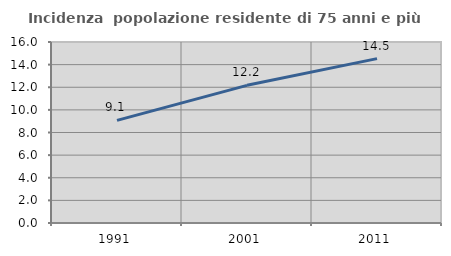
| Category | Incidenza  popolazione residente di 75 anni e più |
|---|---|
| 1991.0 | 9.073 |
| 2001.0 | 12.169 |
| 2011.0 | 14.532 |